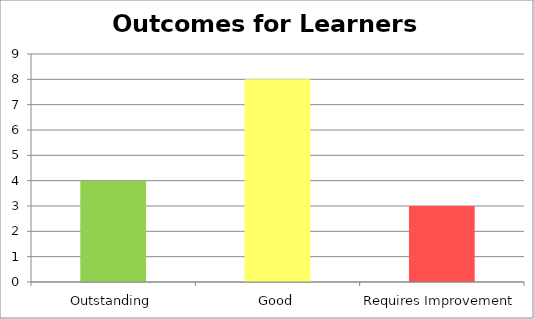
| Category | Series 0 |
|---|---|
| 0 | 4 |
| 1 | 8 |
| 2 | 3 |